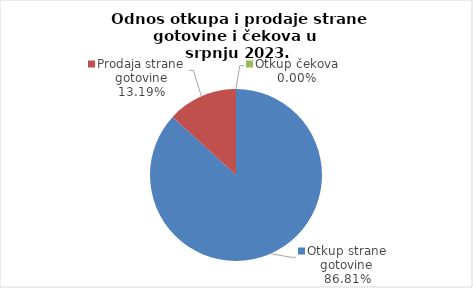
| Category | Series 0 |
|---|---|
| Otkup strane gotovine | 86.806 |
| Prodaja strane gotovine | 13.194 |
| Otkup čekova | 0 |